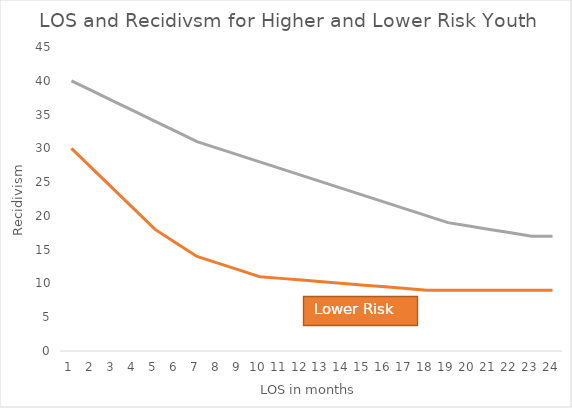
| Category | Series 1 | Series 2 |
|---|---|---|
| 0 | 30 | 40 |
| 1 | 27 | 38.5 |
| 2 | 24 | 37 |
| 3 | 21 | 35.5 |
| 4 | 18 | 34 |
| 5 | 16 | 32.5 |
| 6 | 14 | 31 |
| 7 | 13 | 30 |
| 8 | 12 | 29 |
| 9 | 11 | 28 |
| 10 | 10.75 | 27 |
| 11 | 10.5 | 26 |
| 12 | 10.25 | 25 |
| 13 | 10 | 24 |
| 14 | 9.75 | 23 |
| 15 | 9.5 | 22 |
| 16 | 9.25 | 21 |
| 17 | 9 | 20 |
| 18 | 9 | 19 |
| 19 | 9 | 18.5 |
| 20 | 9 | 18 |
| 21 | 9 | 17.5 |
| 22 | 9 | 17 |
| 23 | 9 | 17 |